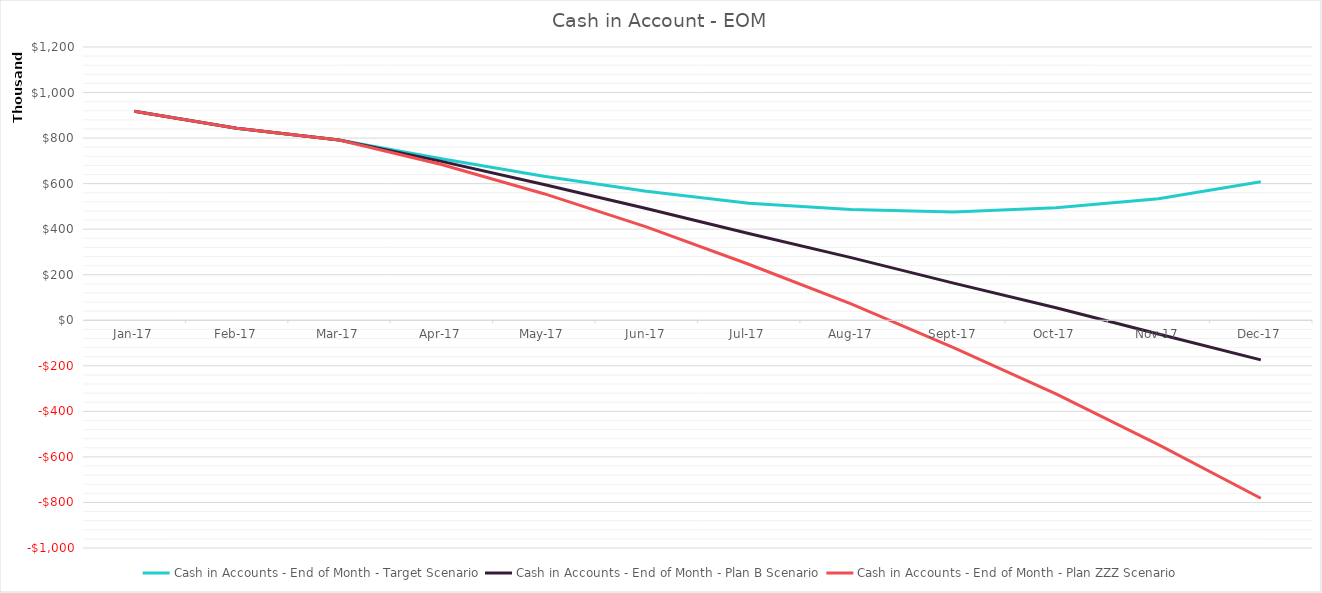
| Category | Cash in Accounts - End of Month - Target Scenario | Cash in Accounts - End of Month - Plan B Scenario | Cash in Accounts - End of Month - Plan ZZZ Scenario |
|---|---|---|---|
| Jan-17 | 917500 | 917500 | 917500 |
| Feb-17 | 843240 | 843240 | 843240 |
| Mar-17 | 791639.2 | 791639.2 | 791639.2 |
| Apr-17 | 708959.656 | 697685.32 | 684185.32 |
| May-17 | 632179.741 | 596374.786 | 555874.786 |
| Jun-17 | 566777.022 | 491044.663 | 410044.663 |
| Jul-17 | 514362.458 | 380994.166 | 245994.166 |
| Aug-17 | 486178.511 | 274969.076 | 72469.076 |
| Sep-17 | 475068.02 | 163115.814 | -120384.186 |
| Oct-17 | 493669.989 | 55161.254 | -322838.746 |
| Nov-17 | 533920.114 | -60104.007 | -546104.007 |
| Dec-17 | 607948.028 | -173947.047 | -781447.047 |